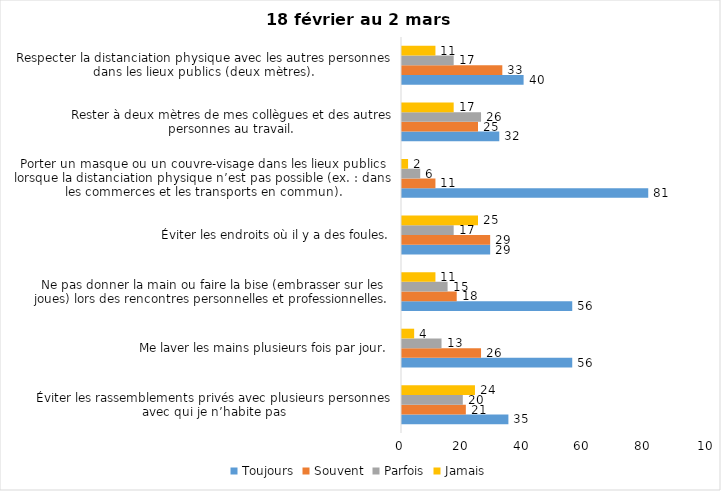
| Category | Toujours | Souvent | Parfois | Jamais |
|---|---|---|---|---|
| Éviter les rassemblements privés avec plusieurs personnes avec qui je n’habite pas | 35 | 21 | 20 | 24 |
| Me laver les mains plusieurs fois par jour. | 56 | 26 | 13 | 4 |
| Ne pas donner la main ou faire la bise (embrasser sur les joues) lors des rencontres personnelles et professionnelles. | 56 | 18 | 15 | 11 |
| Éviter les endroits où il y a des foules. | 29 | 29 | 17 | 25 |
| Porter un masque ou un couvre-visage dans les lieux publics lorsque la distanciation physique n’est pas possible (ex. : dans les commerces et les transports en commun). | 81 | 11 | 6 | 2 |
| Rester à deux mètres de mes collègues et des autres personnes au travail. | 32 | 25 | 26 | 17 |
| Respecter la distanciation physique avec les autres personnes dans les lieux publics (deux mètres). | 40 | 33 | 17 | 11 |